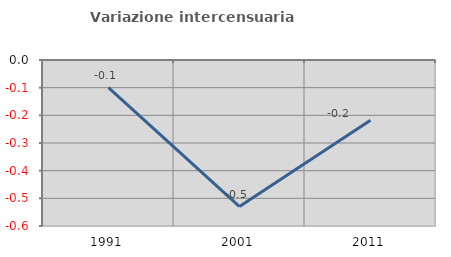
| Category | Variazione intercensuaria annua |
|---|---|
| 1991.0 | -0.1 |
| 2001.0 | -0.53 |
| 2011.0 | -0.218 |